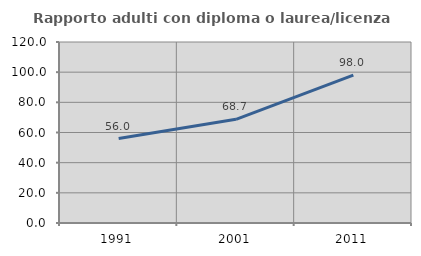
| Category | Rapporto adulti con diploma o laurea/licenza media  |
|---|---|
| 1991.0 | 55.987 |
| 2001.0 | 68.722 |
| 2011.0 | 98.028 |